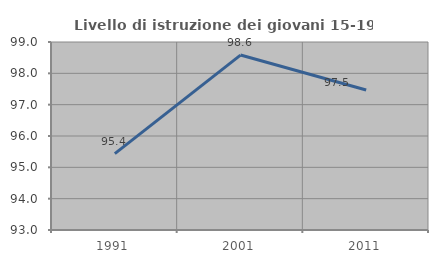
| Category | Livello di istruzione dei giovani 15-19 anni |
|---|---|
| 1991.0 | 95.436 |
| 2001.0 | 98.583 |
| 2011.0 | 97.468 |